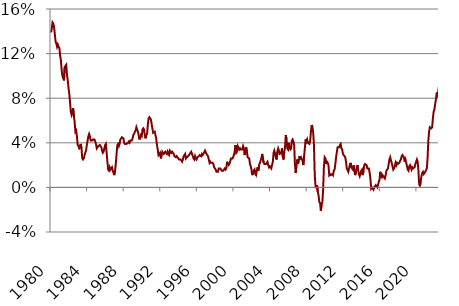
| Category | Series 0 |
|---|---|
| 1980.0 | 0.139 |
| 1980.0 | 0.142 |
| 1980.0 | 0.148 |
| 1980.0 | 0.147 |
| 1980.0 | 0.144 |
| 1980.0 | 0.144 |
| 1980.0 | 0.131 |
| 1980.0 | 0.129 |
| 1980.0 | 0.126 |
| 1980.0 | 0.128 |
| 1980.0 | 0.126 |
| 1980.0 | 0.125 |
| 1981.0 | 0.118 |
| 1981.0 | 0.114 |
| 1981.0 | 0.105 |
| 1981.0 | 0.1 |
| 1981.0 | 0.098 |
| 1981.0 | 0.096 |
| 1981.0 | 0.108 |
| 1981.0 | 0.108 |
| 1981.0 | 0.11 |
| 1981.0 | 0.101 |
| 1981.0 | 0.096 |
| 1981.0 | 0.089 |
| 1982.0 | 0.084 |
| 1982.0 | 0.076 |
| 1982.0 | 0.068 |
| 1982.0 | 0.065 |
| 1982.0 | 0.067 |
| 1982.0 | 0.071 |
| 1982.0 | 0.064 |
| 1982.0 | 0.059 |
| 1982.0 | 0.05 |
| 1982.0 | 0.051 |
| 1982.0 | 0.046 |
| 1982.0 | 0.038 |
| 1983.0 | 0.037 |
| 1983.0 | 0.035 |
| 1983.0 | 0.036 |
| 1983.0 | 0.039 |
| 1983.0 | 0.035 |
| 1983.0 | 0.026 |
| 1983.0 | 0.025 |
| 1983.0 | 0.026 |
| 1983.0 | 0.029 |
| 1983.0 | 0.029 |
| 1983.0 | 0.033 |
| 1983.0 | 0.038 |
| 1984.0 | 0.042 |
| 1984.0 | 0.046 |
| 1984.0 | 0.048 |
| 1984.0 | 0.046 |
| 1984.0 | 0.042 |
| 1984.0 | 0.042 |
| 1984.0 | 0.042 |
| 1984.0 | 0.043 |
| 1984.0 | 0.043 |
| 1984.0 | 0.043 |
| 1984.0 | 0.041 |
| 1984.0 | 0.039 |
| 1985.0 | 0.035 |
| 1985.0 | 0.035 |
| 1985.0 | 0.037 |
| 1985.0 | 0.037 |
| 1985.0 | 0.038 |
| 1985.0 | 0.038 |
| 1985.0 | 0.036 |
| 1985.0 | 0.033 |
| 1985.0 | 0.031 |
| 1985.0 | 0.032 |
| 1985.0 | 0.035 |
| 1985.0 | 0.038 |
| 1986.0 | 0.039 |
| 1986.0 | 0.031 |
| 1986.0 | 0.023 |
| 1986.0 | 0.016 |
| 1986.0 | 0.015 |
| 1986.0 | 0.018 |
| 1986.0 | 0.016 |
| 1986.0 | 0.016 |
| 1986.0 | 0.018 |
| 1986.0 | 0.015 |
| 1986.0 | 0.013 |
| 1986.0 | 0.011 |
| 1987.0 | 0.015 |
| 1987.0 | 0.021 |
| 1987.0 | 0.03 |
| 1987.0 | 0.038 |
| 1987.0 | 0.039 |
| 1987.0 | 0.037 |
| 1987.0 | 0.039 |
| 1987.0 | 0.043 |
| 1987.0 | 0.044 |
| 1987.0 | 0.045 |
| 1987.0 | 0.045 |
| 1987.0 | 0.044 |
| 1988.0 | 0.04 |
| 1988.0 | 0.039 |
| 1988.0 | 0.039 |
| 1988.0 | 0.039 |
| 1988.0 | 0.039 |
| 1988.0 | 0.04 |
| 1988.0 | 0.041 |
| 1988.0 | 0.04 |
| 1988.0 | 0.042 |
| 1988.0 | 0.042 |
| 1988.0 | 0.042 |
| 1988.0 | 0.044 |
| 1989.0 | 0.047 |
| 1989.0 | 0.048 |
| 1989.0 | 0.05 |
| 1989.0 | 0.051 |
| 1989.0 | 0.054 |
| 1989.0 | 0.052 |
| 1989.0 | 0.05 |
| 1989.0 | 0.047 |
| 1989.0 | 0.043 |
| 1989.0 | 0.045 |
| 1989.0 | 0.047 |
| 1989.0 | 0.046 |
| 1990.0 | 0.052 |
| 1990.0 | 0.053 |
| 1990.0 | 0.052 |
| 1990.0 | 0.047 |
| 1990.0 | 0.044 |
| 1990.0 | 0.047 |
| 1990.0 | 0.048 |
| 1990.0 | 0.056 |
| 1990.0 | 0.062 |
| 1990.0 | 0.063 |
| 1990.0 | 0.063 |
| 1990.0 | 0.061 |
| 1991.0 | 0.057 |
| 1991.0 | 0.053 |
| 1991.0 | 0.049 |
| 1991.0 | 0.049 |
| 1991.0 | 0.05 |
| 1991.0 | 0.047 |
| 1991.0 | 0.044 |
| 1991.0 | 0.038 |
| 1991.0 | 0.034 |
| 1991.0 | 0.029 |
| 1991.0 | 0.03 |
| 1991.0 | 0.031 |
| 1992.0 | 0.026 |
| 1992.0 | 0.028 |
| 1992.0 | 0.032 |
| 1992.0 | 0.032 |
| 1992.0 | 0.03 |
| 1992.0 | 0.031 |
| 1992.0 | 0.032 |
| 1992.0 | 0.031 |
| 1992.0 | 0.03 |
| 1992.0 | 0.032 |
| 1992.0 | 0.03 |
| 1992.0 | 0.029 |
| 1993.0 | 0.033 |
| 1993.0 | 0.032 |
| 1993.0 | 0.031 |
| 1993.0 | 0.032 |
| 1993.0 | 0.032 |
| 1993.0 | 0.03 |
| 1993.0 | 0.028 |
| 1993.0 | 0.028 |
| 1993.0 | 0.027 |
| 1993.0 | 0.028 |
| 1993.0 | 0.027 |
| 1993.0 | 0.027 |
| 1994.0 | 0.025 |
| 1994.0 | 0.025 |
| 1994.0 | 0.025 |
| 1994.0 | 0.024 |
| 1994.0 | 0.023 |
| 1994.0 | 0.025 |
| 1994.0 | 0.028 |
| 1994.0 | 0.029 |
| 1994.0 | 0.03 |
| 1994.0 | 0.026 |
| 1994.0 | 0.027 |
| 1994.0 | 0.027 |
| 1995.0 | 0.028 |
| 1995.0 | 0.029 |
| 1995.0 | 0.029 |
| 1995.0 | 0.031 |
| 1995.0 | 0.032 |
| 1995.0 | 0.03 |
| 1995.0 | 0.028 |
| 1995.0 | 0.026 |
| 1995.0 | 0.025 |
| 1995.0 | 0.028 |
| 1995.0 | 0.026 |
| 1995.0 | 0.025 |
| 1996.0 | 0.027 |
| 1996.0 | 0.027 |
| 1996.0 | 0.028 |
| 1996.0 | 0.029 |
| 1996.0 | 0.029 |
| 1996.0 | 0.028 |
| 1996.0 | 0.03 |
| 1996.0 | 0.029 |
| 1996.0 | 0.03 |
| 1996.0 | 0.03 |
| 1996.0 | 0.033 |
| 1996.0 | 0.033 |
| 1997.0 | 0.03 |
| 1997.0 | 0.03 |
| 1997.0 | 0.028 |
| 1997.0 | 0.025 |
| 1997.0 | 0.022 |
| 1997.0 | 0.023 |
| 1997.0 | 0.022 |
| 1997.0 | 0.022 |
| 1997.0 | 0.022 |
| 1997.0 | 0.021 |
| 1997.0 | 0.018 |
| 1997.0 | 0.017 |
| 1998.0 | 0.016 |
| 1998.0 | 0.014 |
| 1998.0 | 0.014 |
| 1998.0 | 0.014 |
| 1998.0 | 0.017 |
| 1998.0 | 0.017 |
| 1998.0 | 0.017 |
| 1998.0 | 0.016 |
| 1998.0 | 0.015 |
| 1998.0 | 0.015 |
| 1998.0 | 0.015 |
| 1998.0 | 0.016 |
| 1999.0 | 0.017 |
| 1999.0 | 0.016 |
| 1999.0 | 0.017 |
| 1999.0 | 0.023 |
| 1999.0 | 0.021 |
| 1999.0 | 0.02 |
| 1999.0 | 0.021 |
| 1999.0 | 0.023 |
| 1999.0 | 0.026 |
| 1999.0 | 0.026 |
| 1999.0 | 0.026 |
| 1999.0 | 0.027 |
| 2000.0 | 0.027 |
| 2000.0 | 0.032 |
| 2000.0 | 0.038 |
| 2000.0 | 0.031 |
| 2000.0 | 0.032 |
| 2000.0 | 0.037 |
| 2000.0 | 0.037 |
| 2000.0 | 0.034 |
| 2000.0 | 0.035 |
| 2000.0 | 0.034 |
| 2000.0 | 0.034 |
| 2000.0 | 0.034 |
| 2001.0 | 0.037 |
| 2001.0 | 0.035 |
| 2001.0 | 0.029 |
| 2001.0 | 0.033 |
| 2001.0 | 0.036 |
| 2001.0 | 0.032 |
| 2001.0 | 0.027 |
| 2001.0 | 0.027 |
| 2001.0 | 0.026 |
| 2001.0 | 0.021 |
| 2001.0 | 0.019 |
| 2001.0 | 0.016 |
| 2002.0 | 0.011 |
| 2002.0 | 0.011 |
| 2002.0 | 0.015 |
| 2002.0 | 0.016 |
| 2002.0 | 0.012 |
| 2002.0 | 0.011 |
| 2002.0 | 0.015 |
| 2002.0 | 0.018 |
| 2002.0 | 0.015 |
| 2002.0 | 0.02 |
| 2002.0 | 0.022 |
| 2002.0 | 0.024 |
| 2003.0 | 0.026 |
| 2003.0 | 0.03 |
| 2003.0 | 0.03 |
| 2003.0 | 0.022 |
| 2003.0 | 0.021 |
| 2003.0 | 0.021 |
| 2003.0 | 0.021 |
| 2003.0 | 0.022 |
| 2003.0 | 0.023 |
| 2003.0 | 0.02 |
| 2003.0 | 0.018 |
| 2003.0 | 0.019 |
| 2004.0 | 0.019 |
| 2004.0 | 0.017 |
| 2004.0 | 0.017 |
| 2004.0 | 0.023 |
| 2004.0 | 0.031 |
| 2004.0 | 0.033 |
| 2004.0 | 0.03 |
| 2004.0 | 0.027 |
| 2004.0 | 0.025 |
| 2004.0 | 0.032 |
| 2004.0 | 0.035 |
| 2004.0 | 0.033 |
| 2005.0 | 0.03 |
| 2005.0 | 0.03 |
| 2005.0 | 0.031 |
| 2005.0 | 0.035 |
| 2005.0 | 0.028 |
| 2005.0 | 0.025 |
| 2005.0 | 0.032 |
| 2005.0 | 0.036 |
| 2005.0 | 0.047 |
| 2005.0 | 0.043 |
| 2005.0 | 0.035 |
| 2005.0 | 0.034 |
| 2006.0 | 0.04 |
| 2006.0 | 0.036 |
| 2006.0 | 0.034 |
| 2006.0 | 0.035 |
| 2006.0 | 0.042 |
| 2006.0 | 0.043 |
| 2006.0 | 0.041 |
| 2006.0 | 0.038 |
| 2006.0 | 0.021 |
| 2006.0 | 0.013 |
| 2006.0 | 0.02 |
| 2006.0 | 0.025 |
| 2007.0 | 0.021 |
| 2007.0 | 0.024 |
| 2007.0 | 0.028 |
| 2007.0 | 0.026 |
| 2007.0 | 0.027 |
| 2007.0 | 0.027 |
| 2007.0 | 0.024 |
| 2007.0 | 0.02 |
| 2007.0 | 0.028 |
| 2007.0 | 0.035 |
| 2007.0 | 0.043 |
| 2007.0 | 0.041 |
| 2008.0 | 0.043 |
| 2008.0 | 0.04 |
| 2008.0 | 0.04 |
| 2008.0 | 0.039 |
| 2008.0 | 0.042 |
| 2008.0 | 0.05 |
| 2008.0 | 0.056 |
| 2008.0 | 0.054 |
| 2008.0 | 0.049 |
| 2008.0 | 0.037 |
| 2008.0 | 0.011 |
| 2008.0 | 0.001 |
| 2009.0 | 0 |
| 2009.0 | 0.002 |
| 2009.0 | -0.004 |
| 2009.0 | -0.007 |
| 2009.0 | -0.013 |
| 2009.0 | -0.014 |
| 2009.0 | -0.021 |
| 2009.0 | -0.015 |
| 2009.0 | -0.013 |
| 2009.0 | -0.002 |
| 2009.0 | 0.018 |
| 2009.0 | 0.027 |
| 2010.0 | 0.026 |
| 2010.0 | 0.021 |
| 2010.0 | 0.023 |
| 2010.0 | 0.022 |
| 2010.0 | 0.02 |
| 2010.0 | 0.011 |
| 2010.0 | 0.012 |
| 2010.0 | 0.011 |
| 2010.0 | 0.011 |
| 2010.0 | 0.012 |
| 2010.0 | 0.011 |
| 2010.0 | 0.015 |
| 2011.0 | 0.016 |
| 2011.0 | 0.021 |
| 2011.0 | 0.027 |
| 2011.0 | 0.032 |
| 2011.0 | 0.036 |
| 2011.0 | 0.036 |
| 2011.0 | 0.036 |
| 2011.0 | 0.038 |
| 2011.0 | 0.039 |
| 2011.0 | 0.035 |
| 2011.0 | 0.034 |
| 2011.0 | 0.03 |
| 2012.0 | 0.029 |
| 2012.0 | 0.029 |
| 2012.0 | 0.027 |
| 2012.0 | 0.023 |
| 2012.0 | 0.017 |
| 2012.0 | 0.017 |
| 2012.0 | 0.014 |
| 2012.0 | 0.017 |
| 2012.0 | 0.02 |
| 2012.0 | 0.022 |
| 2012.0 | 0.018 |
| 2012.0 | 0.017 |
| 2013.0 | 0.016 |
| 2013.0 | 0.02 |
| 2013.0 | 0.015 |
| 2013.0 | 0.011 |
| 2013.0 | 0.014 |
| 2013.0 | 0.018 |
| 2013.0 | 0.02 |
| 2013.0 | 0.015 |
| 2013.0 | 0.012 |
| 2013.0 | 0.01 |
| 2013.0 | 0.012 |
| 2013.0 | 0.015 |
| 2014.0 | 0.016 |
| 2014.0 | 0.011 |
| 2014.0 | 0.015 |
| 2014.0 | 0.02 |
| 2014.0 | 0.021 |
| 2014.0 | 0.021 |
| 2014.0 | 0.02 |
| 2014.0 | 0.017 |
| 2014.0 | 0.017 |
| 2014.0 | 0.017 |
| 2014.0 | 0.013 |
| 2014.0 | 0.008 |
| 2015.0 | -0.001 |
| 2015.0 | 0 |
| 2015.0 | -0.001 |
| 2015.0 | -0.002 |
| 2015.0 | 0 |
| 2015.0 | 0.001 |
| 2015.0 | 0.002 |
| 2015.0 | 0.002 |
| 2015.0 | 0 |
| 2015.0 | 0.002 |
| 2015.0 | 0.005 |
| 2015.0 | 0.007 |
| 2016.0 | 0.014 |
| 2016.0 | 0.01 |
| 2016.0 | 0.009 |
| 2016.0 | 0.011 |
| 2016.0 | 0.01 |
| 2016.0 | 0.01 |
| 2016.0 | 0.008 |
| 2016.0 | 0.011 |
| 2016.0 | 0.015 |
| 2016.0 | 0.016 |
| 2016.0 | 0.017 |
| 2016.0 | 0.021 |
| 2017.0 | 0.025 |
| 2017.0 | 0.027 |
| 2017.0 | 0.024 |
| 2017.0 | 0.022 |
| 2017.0 | 0.019 |
| 2017.0 | 0.016 |
| 2017.0 | 0.017 |
| 2017.0 | 0.019 |
| 2017.0 | 0.022 |
| 2017.0 | 0.02 |
| 2017.0 | 0.022 |
| 2017.0 | 0.021 |
| 2018.0 | 0.021 |
| 2018.0 | 0.022 |
| 2018.0 | 0.024 |
| 2018.0 | 0.025 |
| 2018.0 | 0.028 |
| 2018.0 | 0.029 |
| 2018.0 | 0.029 |
| 2018.0 | 0.027 |
| 2018.0 | 0.023 |
| 2018.0 | 0.025 |
| 2018.0 | 0.022 |
| 2018.0 | 0.019 |
| 2019.0 | 0.016 |
| 2019.0 | 0.015 |
| 2019.0 | 0.019 |
| 2019.0 | 0.02 |
| 2019.0 | 0.018 |
| 2019.0 | 0.016 |
| 2019.0 | 0.018 |
| 2019.0 | 0.017 |
| 2019.0 | 0.017 |
| 2019.0 | 0.018 |
| 2019.0 | 0.021 |
| 2019.0 | 0.023 |
| 2020.0 | 0.025 |
| 2020.0 | 0.023 |
| 2020.0 | 0.015 |
| 2020.0 | 0.003 |
| 2020.0 | 0.001 |
| 2020.0 | 0.006 |
| 2020.0 | 0.01 |
| 2020.0 | 0.013 |
| 2020.0 | 0.014 |
| 2020.0 | 0.012 |
| 2020.0 | 0.012 |
| 2020.0 | 0.014 |
| 2021.0 | 0.014 |
| 2021.0 | 0.017 |
| 2021.0 | 0.026 |
| 2021.0 | 0.042 |
| 2021.0 | 0.05 |
| 2021.0 | 0.054 |
| 2021.0 | 0.054 |
| 2021.0 | 0.053 |
| 2021.0 | 0.054 |
| 2021.0 | 0.062 |
| 2021.0 | 0.068 |
| 2021.0 | 0.07 |
| 2022.0 | 0.075 |
| 2022.0 | 0.079 |
| 2022.0 | 0.085 |
| 2022.0 | 0.083 |
| 2022.0 | 0.086 |
| 2022.0 | 0.091 |